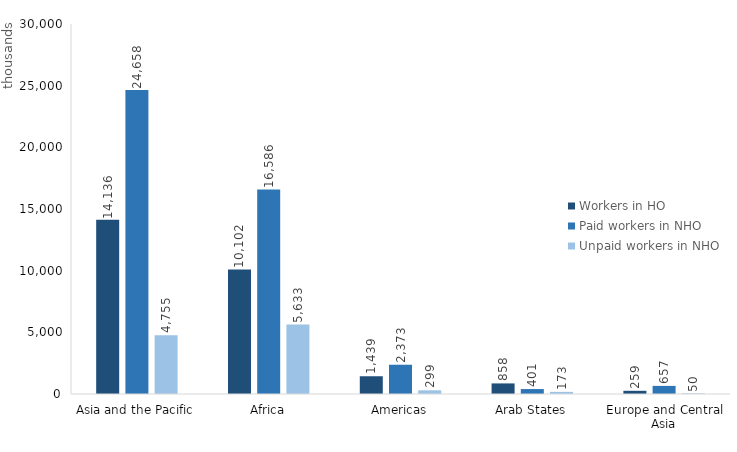
| Category | Workers in HO | Paid workers in NHO | Unpaid workers in NHO |
|---|---|---|---|
| Asia and the Pacific | 14136 | 24658 | 4755 |
| Africa | 10102 | 16586 | 5633 |
| Americas | 1439 | 2373 | 299 |
| Arab States | 858 | 401 | 173 |
| Europe and Central Asia | 259 | 657 | 50 |